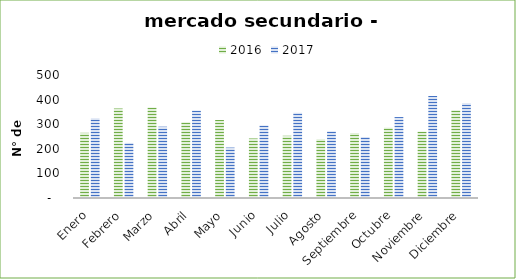
| Category | 2016 | 2017 |
|---|---|---|
| Enero | 265 | 324 |
| Febrero | 364 | 224 |
| Marzo | 368 | 290 |
| Abril | 308 | 356 |
| Mayo | 317 | 205 |
| Junio | 242 | 295 |
| Julio | 253 | 347 |
| Agosto | 239 | 271 |
| Septiembre | 264 | 248 |
| Octubre | 286 | 329 |
| Noviembre | 270 | 415 |
| Diciembre | 357 | 385 |